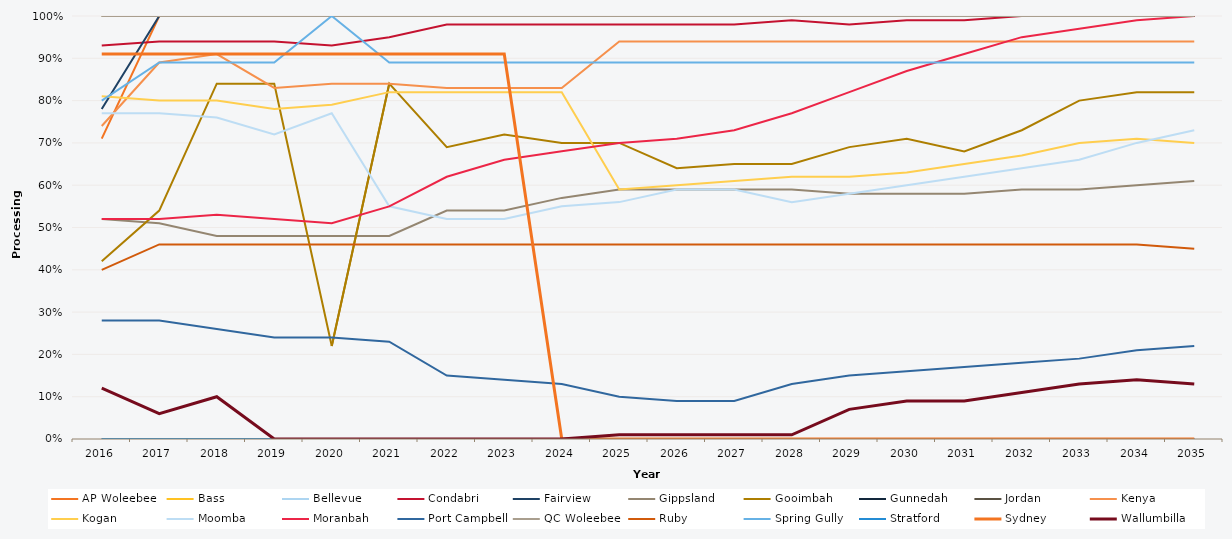
| Category | AP Woleebee | Bass | Bellevue | Condabri | Fairview | Gippsland | Gooimbah | Gunnedah | Jordan | Kenya | Kogan | Moomba | Moranbah | Port Campbell | QC Woleebee | Ruby | Spring Gully | Stratford | Sydney | Wallumbilla |
|---|---|---|---|---|---|---|---|---|---|---|---|---|---|---|---|---|---|---|---|---|
| 2016.0 | 0.71 | 1 | 1 | 0.93 | 0.78 | 0.52 | 0.42 | 0 | 1 | 0.74 | 0.81 | 0.77 | 0.52 | 0.28 | 1 | 0.4 | 0.8 | 0 | 0.91 | 0.12 |
| 2017.0 | 1 | 1 | 1 | 0.94 | 1 | 0.51 | 0.54 | 0 | 1 | 0.89 | 0.8 | 0.77 | 0.52 | 0.28 | 1 | 0.46 | 0.89 | 0 | 0.91 | 0.06 |
| 2018.0 | 1 | 1 | 1 | 0.94 | 1 | 0.48 | 0.84 | 0 | 1 | 0.91 | 0.8 | 0.76 | 0.53 | 0.26 | 1 | 0.46 | 0.89 | 0 | 0.91 | 0.1 |
| 2019.0 | 1 | 1 | 1 | 0.94 | 1 | 0.48 | 0.84 | 0 | 1 | 0.83 | 0.78 | 0.72 | 0.52 | 0.24 | 1 | 0.46 | 0.89 | 0 | 0.91 | 0 |
| 2020.0 | 1 | 1 | 1 | 0.93 | 1 | 0.48 | 0.22 | 0 | 1 | 0.84 | 0.79 | 0.77 | 0.51 | 0.24 | 1 | 0.46 | 1 | 0 | 0.91 | 0 |
| 2021.0 | 1 | 1 | 1 | 0.95 | 1 | 0.48 | 0.84 | 0 | 1 | 0.84 | 0.82 | 0.55 | 0.55 | 0.23 | 1 | 0.46 | 0.89 | 0 | 0.91 | 0 |
| 2022.0 | 1 | 1 | 1 | 0.98 | 1 | 0.54 | 0.69 | 0 | 1 | 0.83 | 0.82 | 0.52 | 0.62 | 0.15 | 1 | 0.46 | 0.89 | 0 | 0.91 | 0 |
| 2023.0 | 1 | 1 | 1 | 0.98 | 1 | 0.54 | 0.72 | 0 | 1 | 0.83 | 0.82 | 0.52 | 0.66 | 0.14 | 1 | 0.46 | 0.89 | 0 | 0.91 | 0 |
| 2024.0 | 1 | 1 | 1 | 0.98 | 1 | 0.57 | 0.7 | 0 | 1 | 0.83 | 0.82 | 0.55 | 0.68 | 0.13 | 1 | 0.46 | 0.89 | 0 | 0 | 0 |
| 2025.0 | 1 | 1 | 1 | 0.98 | 1 | 0.59 | 0.7 | 0 | 1 | 0.94 | 0.59 | 0.56 | 0.7 | 0.1 | 1 | 0.46 | 0.89 | 0 | 0 | 0.01 |
| 2026.0 | 1 | 1 | 1 | 0.98 | 1 | 0.59 | 0.64 | 0 | 1 | 0.94 | 0.6 | 0.59 | 0.71 | 0.09 | 1 | 0.46 | 0.89 | 0 | 0 | 0.01 |
| 2027.0 | 1 | 1 | 1 | 0.98 | 1 | 0.59 | 0.65 | 0 | 1 | 0.94 | 0.61 | 0.59 | 0.73 | 0.09 | 1 | 0.46 | 0.89 | 0 | 0 | 0.01 |
| 2028.0 | 1 | 1 | 1 | 0.99 | 1 | 0.59 | 0.65 | 0 | 1 | 0.94 | 0.62 | 0.56 | 0.77 | 0.13 | 1 | 0.46 | 0.89 | 0 | 0 | 0.01 |
| 2029.0 | 1 | 1 | 1 | 0.98 | 1 | 0.58 | 0.69 | 0 | 1 | 0.94 | 0.62 | 0.58 | 0.82 | 0.15 | 1 | 0.46 | 0.89 | 0 | 0 | 0.07 |
| 2030.0 | 1 | 1 | 1 | 0.99 | 1 | 0.58 | 0.71 | 0 | 1 | 0.94 | 0.63 | 0.6 | 0.87 | 0.16 | 1 | 0.46 | 0.89 | 0 | 0 | 0.09 |
| 2031.0 | 1 | 1 | 1 | 0.99 | 1 | 0.58 | 0.68 | 0 | 1 | 0.94 | 0.65 | 0.62 | 0.91 | 0.17 | 1 | 0.46 | 0.89 | 0 | 0 | 0.09 |
| 2032.0 | 1 | 1 | 1 | 1 | 1 | 0.59 | 0.73 | 0 | 1 | 0.94 | 0.67 | 0.64 | 0.95 | 0.18 | 1 | 0.46 | 0.89 | 0 | 0 | 0.11 |
| 2033.0 | 1 | 1 | 1 | 1 | 1 | 0.59 | 0.8 | 0 | 1 | 0.94 | 0.7 | 0.66 | 0.97 | 0.19 | 1 | 0.46 | 0.89 | 0 | 0 | 0.13 |
| 2034.0 | 1 | 1 | 1 | 1 | 1 | 0.6 | 0.82 | 0 | 1 | 0.94 | 0.71 | 0.7 | 0.99 | 0.21 | 1 | 0.46 | 0.89 | 0 | 0 | 0.14 |
| 2035.0 | 1 | 1 | 1 | 1 | 1 | 0.61 | 0.82 | 0 | 1 | 0.94 | 0.7 | 0.73 | 1 | 0.22 | 1 | 0.45 | 0.89 | 0 | 0 | 0.13 |